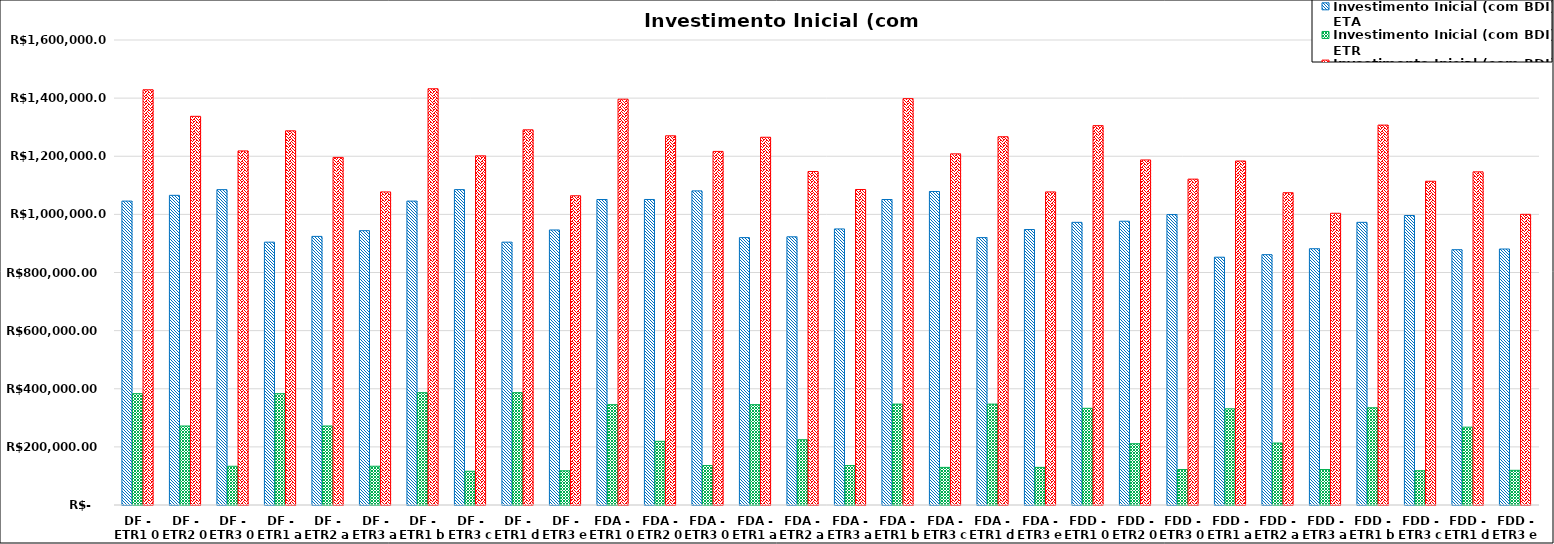
| Category | Investimento Inicial (com BDI) |
|---|---|
| DF - ETR1 0 | 1428730.993 |
| DF - ETR2 0 | 1337376.508 |
| DF - ETR3 0 | 1218360.7 |
| DF - ETR1 a | 1287471.308 |
| DF - ETR2 a | 1196090.742 |
| DF - ETR3 a | 1077284.719 |
| DF - ETR1 b | 1432221.523 |
| DF - ETR3 c | 1201337.043 |
| DF - ETR1 d | 1290961.839 |
| DF - ETR3 e | 1064050.719 |
| FDA - ETR1 0 | 1396391.937 |
| FDA - ETR2 0 | 1270346.238 |
| FDA - ETR3 0 | 1216630.308 |
| FDA - ETR1 a | 1265377.644 |
| FDA - ETR2 a | 1147541.297 |
| FDA - ETR3 a | 1085616.015 |
| FDA - ETR1 b | 1398213.671 |
| FDA - ETR3 c | 1208221.002 |
| FDA - ETR1 d | 1267199.378 |
| FDA - ETR3 e | 1077206.709 |
| FDD - ETR1 0 | 1305346.268 |
| FDD - ETR2 0 | 1187290.045 |
| FDD - ETR3 0 | 1121289.385 |
| FDD - ETR1 a | 1183552.144 |
| FDD - ETR2 a | 1074543.845 |
| FDD - ETR3 a | 1003813.287 |
| FDD - ETR1 b | 1307171.699 |
| FDD - ETR3 c | 1113961.787 |
| FDD - ETR1 d | 1146245.007 |
| FDD - ETR3 e | 1000159.82 |